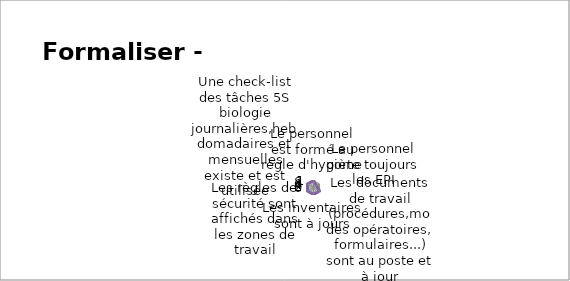
| Category | Series 2 |
|---|---|
| Le personnel est formé au règle d'hygiène | 10 |
| Le personnel porte toujours les EPI | 5 |
| Les documents de travail (procédures,modes opératoires, formulaires...) sont au poste et à jour | 10 |
| Les inventaires sont à jours | 10 |
| Les règles de sécurité sont affichés dans les zones de travail | 10 |
| Une check-list des tâches 5S biologie journalières,hebdomadaires et mensuelles existe et est utilisée | 10 |